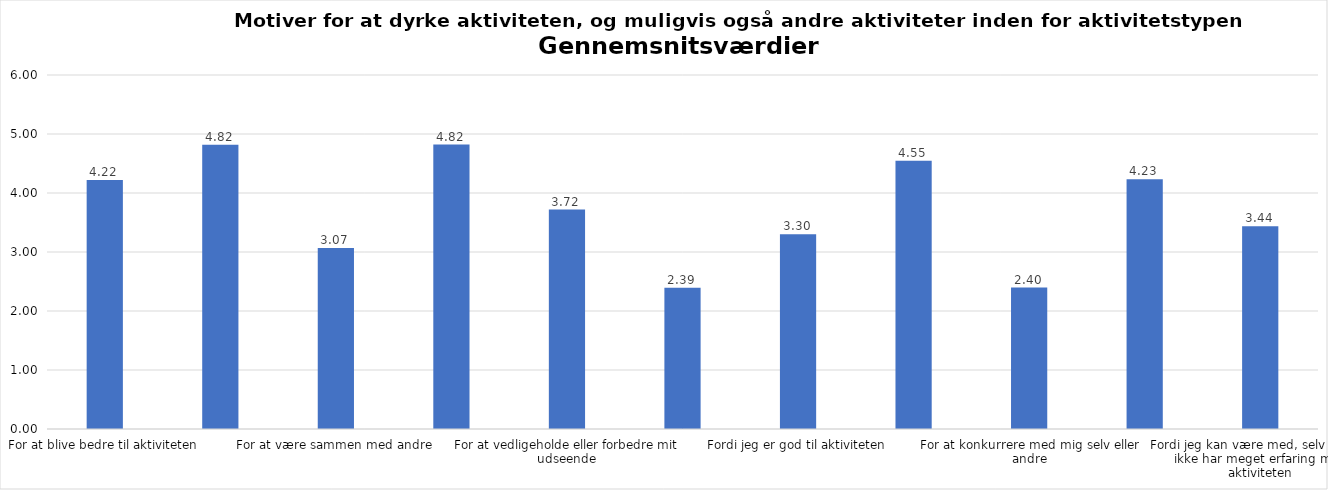
| Category | Gennemsnit |
|---|---|
| For at blive bedre til aktiviteten | 4.219 |
| For at vedligeholde eller forbedre min sundhed (fx helbred, fysisk form) | 4.818 |
| For at være sammen med andre | 3.069 |
| For at gøre noget godt for mig selv | 4.821 |
| For at vedligeholde eller forbedre mit udseende | 3.719 |
| Fordi andre i min omgangskreds opmuntrer mig til det | 2.394 |
| Fordi jeg er god til aktiviteten | 3.299 |
| Fordi jeg godt kan lide aktiviteten | 4.545 |
| For at konkurrere med mig selv eller andre | 2.397 |
| Fordi aktiviteten passer godt ind i min hverdag | 4.234 |
| Fordi jeg kan være med, selv om jeg ikke har meget erfaring med aktiviteten | 3.436 |